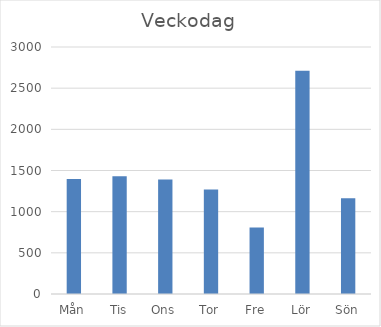
| Category | Summa |
|---|---|
| Mån | 1398 |
| Tis | 1429 |
| Ons | 1390 |
| Tor | 1270 |
| Fre | 808 |
| Lör | 2712 |
| Sön | 1163 |